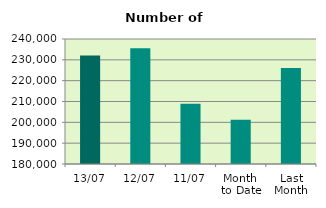
| Category | Series 0 |
|---|---|
| 13/07 | 232112 |
| 12/07 | 235554 |
| 11/07 | 208924 |
| Month 
to Date | 201225.111 |
| Last
Month | 226069.545 |